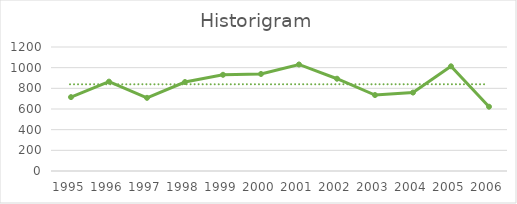
| Category | Series 0 |
|---|---|
| 1995.0 | 715 |
| 1996.0 | 865 |
| 1997.0 | 708 |
| 1998.0 | 861 |
| 1999.0 | 931 |
| 2000.0 | 939 |
| 2001.0 | 1031 |
| 2002.0 | 893 |
| 2003.0 | 735 |
| 2004.0 | 759 |
| 2005.0 | 1013 |
| 2006.0 | 622 |